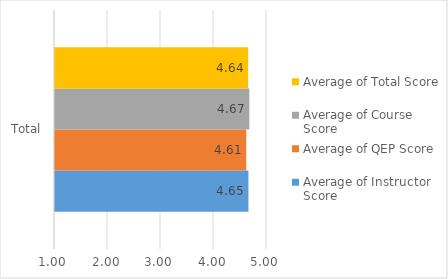
| Category | Average of Instructor Score | Average of QEP Score | Average of Course Score | Average of Total Score |
|---|---|---|---|---|
| Total | 4.65 | 4.608 | 4.666 | 4.644 |